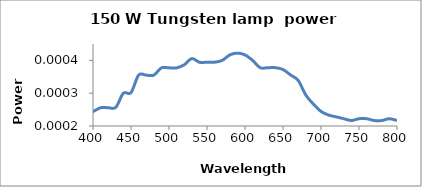
| Category | Series 0 |
|---|---|
| 800.0 | 0 |
| 790.0 | 0 |
| 780.0 | 0 |
| 770.0 | 0 |
| 760.0 | 0 |
| 750.0 | 0 |
| 740.0 | 0 |
| 730.0 | 0 |
| 720.0 | 0 |
| 710.0 | 0 |
| 700.0 | 0 |
| 690.0 | 0 |
| 680.0 | 0 |
| 670.0 | 0 |
| 660.0 | 0 |
| 650.0 | 0 |
| 640.0 | 0 |
| 630.0 | 0 |
| 620.0 | 0 |
| 610.0 | 0 |
| 600.0 | 0 |
| 590.0 | 0 |
| 580.0 | 0 |
| 570.0 | 0 |
| 560.0 | 0 |
| 550.0 | 0 |
| 540.0 | 0 |
| 530.0 | 0 |
| 520.0 | 0 |
| 510.0 | 0 |
| 500.0 | 0 |
| 490.0 | 0 |
| 480.0 | 0 |
| 470.0 | 0 |
| 460.0 | 0 |
| 450.0 | 0 |
| 440.0 | 0 |
| 430.0 | 0 |
| 420.0 | 0 |
| 410.0 | 0 |
| 400.0 | 0 |